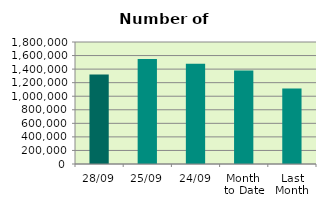
| Category | Series 0 |
|---|---|
| 28/09 | 1319994 |
| 25/09 | 1549252 |
| 24/09 | 1478170 |
| Month 
to Date | 1379650.9 |
| Last
Month | 1113186.286 |